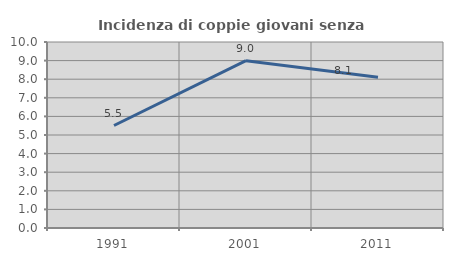
| Category | Incidenza di coppie giovani senza figli |
|---|---|
| 1991.0 | 5.51 |
| 2001.0 | 8.996 |
| 2011.0 | 8.105 |